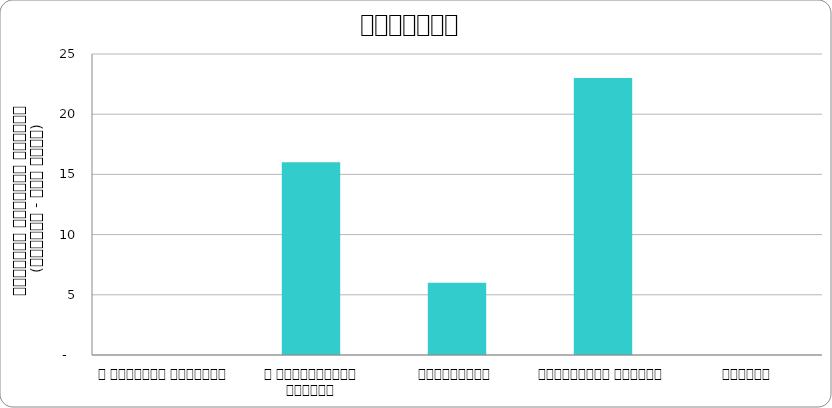
| Category | कुटनीति |
|---|---|
| द हिमालयन टाइम्स् | 0 |
| द काठमाण्डौं पोस्ट् | 16 |
| कान्तिपुर | 6 |
| अन्नपूर्ण पोस्ट् | 23 |
| नागरिक | 0 |